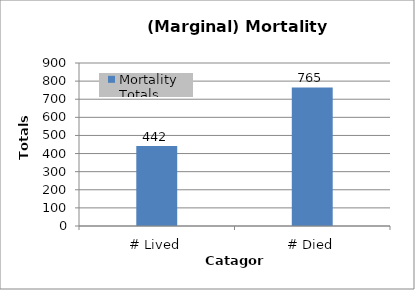
| Category | Mortality Totals |
|---|---|
| # Lived | 442 |
| # Died | 765 |